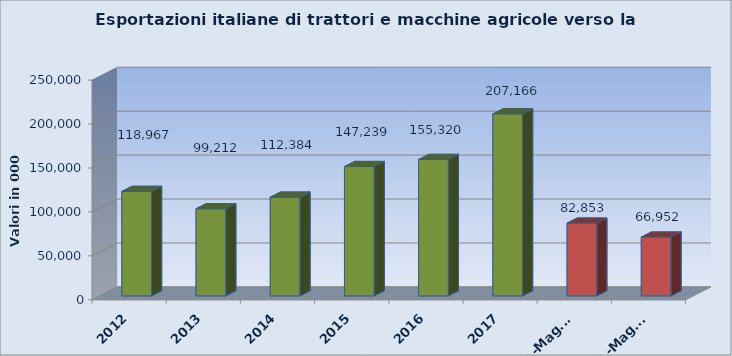
| Category | EXPORTS |
|---|---|
| 2012 | 118967.342 |
| 2013 | 99212.058 |
| 2014 | 112383.828 |
| 2015 | 147239 |
| 2016 | 155320 |
| 2017 | 207166 |
| Gen.-Mag.17 | 82853 |
| Gen.-Mag.18 | 66952 |